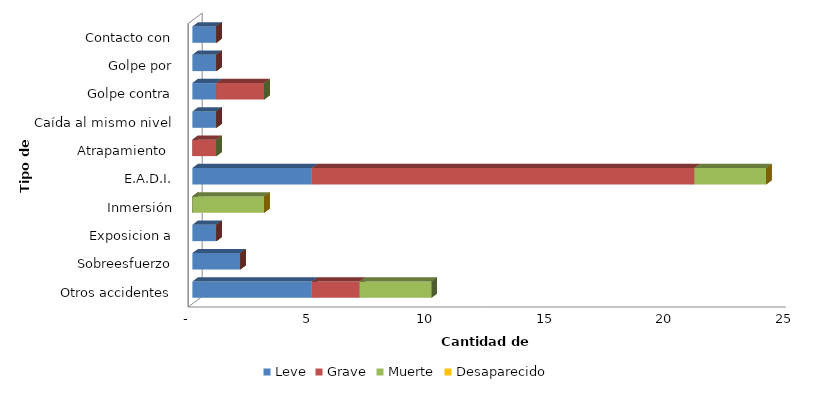
| Category | Leve | Grave | Muerte | Desaparecido |
|---|---|---|---|---|
| Contacto con | 1 | 0 | 0 | 0 |
| Golpe por | 1 | 0 | 0 | 0 |
| Golpe contra | 1 | 2 | 0 | 0 |
| Caída al mismo nivel | 1 | 0 | 0 | 0 |
| Atrapamiento  | 0 | 1 | 0 | 0 |
| E.A.D.I. | 5 | 16 | 3 | 0 |
| Inmersión | 0 | 0 | 3 | 0 |
| Exposicion a | 1 | 0 | 0 | 0 |
| Sobreesfuerzo | 2 | 0 | 0 | 0 |
| Otros accidentes | 5 | 2 | 3 | 0 |